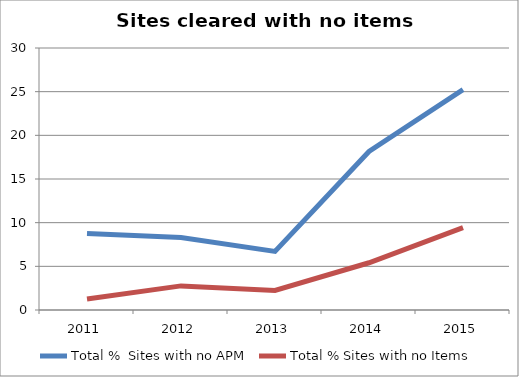
| Category | Total %  Sites with no APM | Total % Sites with no Items |
|---|---|---|
| 2011.0 | 8.75 | 1.25 |
| 2012.0 | 8.29 | 2.76 |
| 2013.0 | 6.71 | 2.24 |
| 2014.0 | 18.15 | 5.41 |
| 2015.0 | 25.23 | 9.44 |